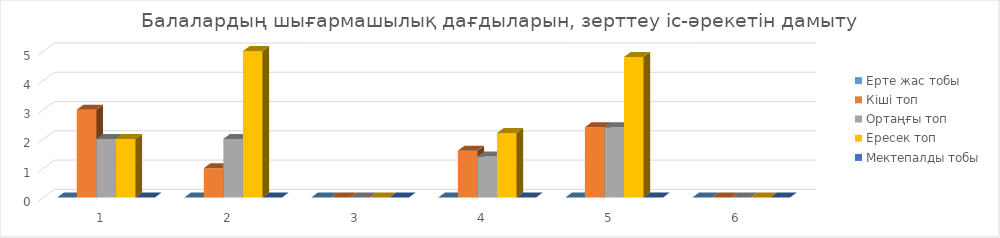
| Category | Ерте жас тобы  | Кіші топ | Ортаңғы топ | Ересек топ | Мектепалды тобы |
|---|---|---|---|---|---|
| 0 | 0 | 3 | 2 | 2 | 0 |
| 1 | 0 | 1 | 2 | 5 | 0 |
| 2 | 0 | 0 | 0 | 0 | 0 |
| 3 | 0 | 1.6 | 1.4 | 2.2 | 0 |
| 4 | 0 | 2.4 | 2.4 | 4.8 | 0 |
| 5 | 0 | 0 | 0 | 0 | 0 |